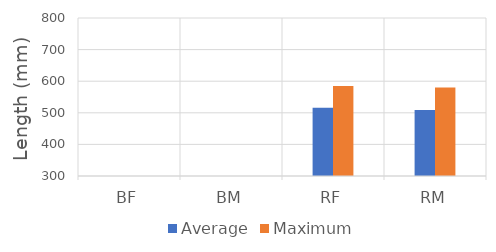
| Category | Average | Maximum |
|---|---|---|
| BF | 0 | 0 |
| BM | 0 | 0 |
| RF | 516 | 585 |
| RM | 509 | 580 |